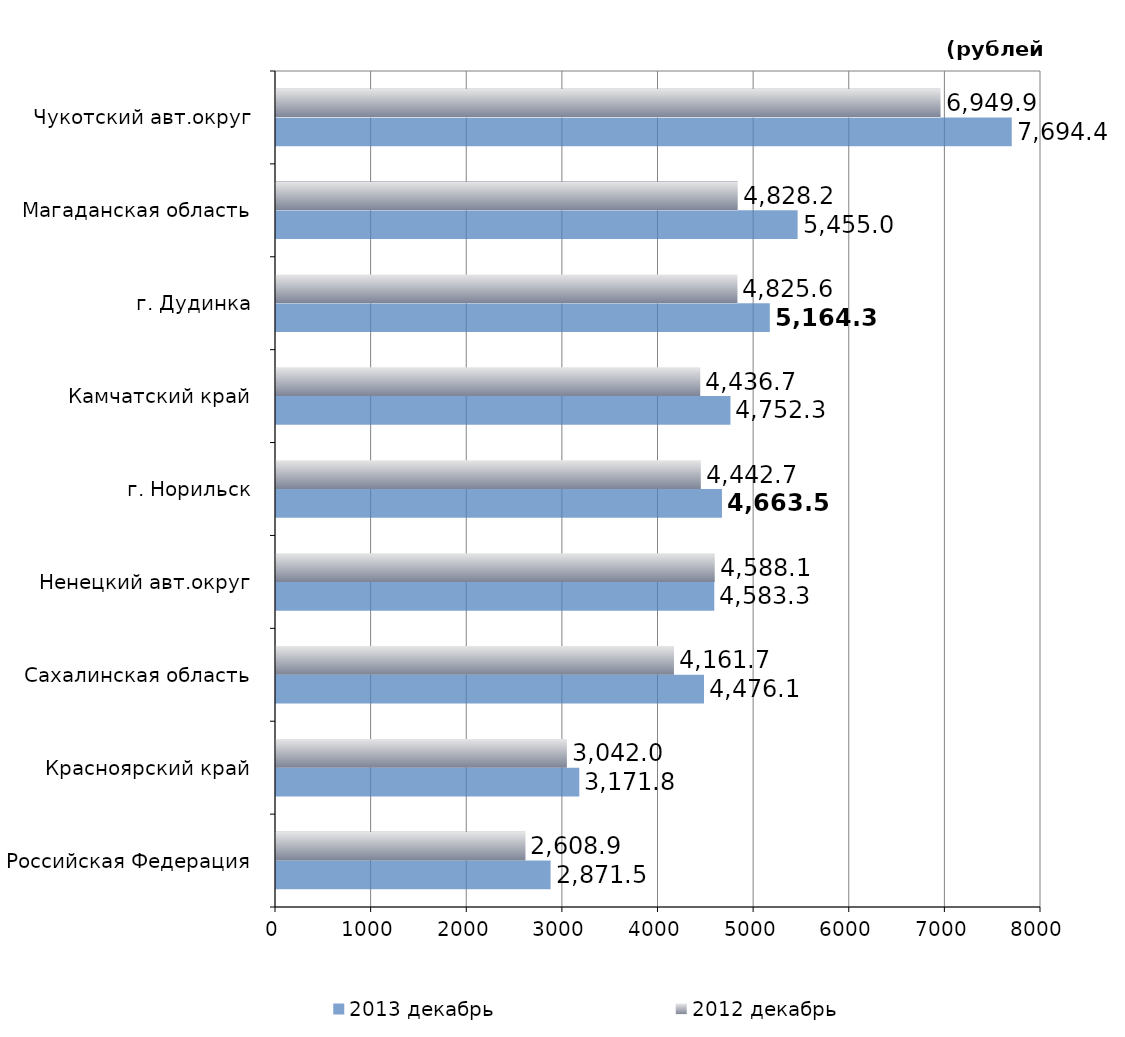
| Category | 2013 декабрь | 2012 декабрь |
|---|---|---|
| Российская Федеpация | 2871.48 | 2608.94 |
| Красноярский край | 3171.84 | 3042.02 |
| Сахалинская область | 4476.08 | 4161.65 |
| Ненецкий авт.округ | 4583.26 | 4588.13 |
| г. Норильск | 4663.51 | 4442.67 |
| Камчатский край | 4752.33 | 4436.69 |
| г. Дудинка | 5164.3 | 4825.62 |
| Магаданская область | 5454.98 | 4828.15 |
| Чукотский авт.округ | 7694.44 | 6949.85 |